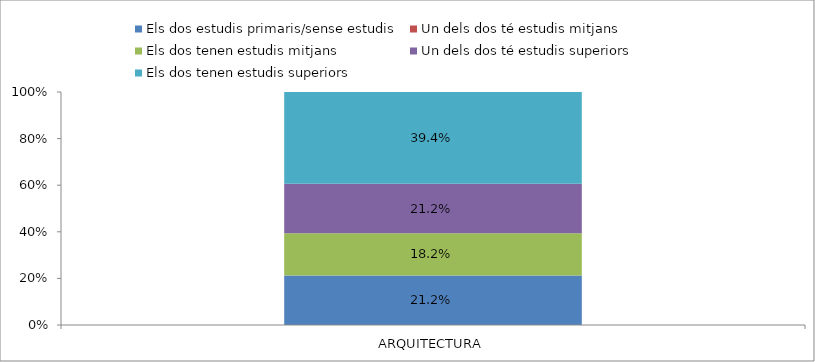
| Category | Els dos estudis primaris/sense estudis | Un dels dos té estudis mitjans | Els dos tenen estudis mitjans | Un dels dos té estudis superiors | Els dos tenen estudis superiors |
|---|---|---|---|---|---|
| ARQUITECTURA | 0.212 | 0 | 0.182 | 0.212 | 0.394 |